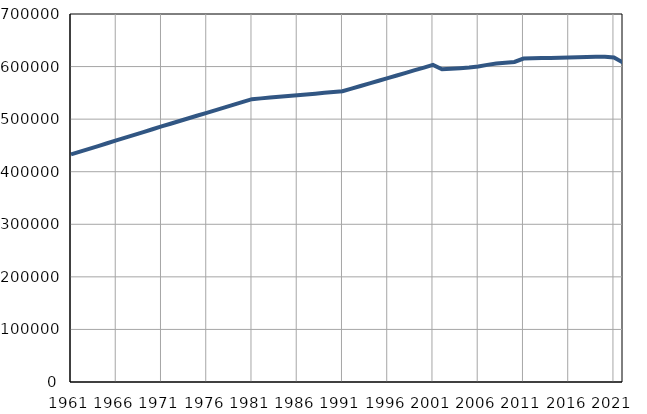
| Category | Број
становника |
|---|---|
| 1961.0 | 432873 |
| 1962.0 | 438194 |
| 1963.0 | 443515 |
| 1964.0 | 448836 |
| 1965.0 | 454157 |
| 1966.0 | 459478 |
| 1967.0 | 464799 |
| 1968.0 | 470120 |
| 1969.0 | 475441 |
| 1970.0 | 480762 |
| 1971.0 | 486083 |
| 1972.0 | 491276 |
| 1973.0 | 496470 |
| 1974.0 | 501663 |
| 1975.0 | 506856 |
| 1976.0 | 512050 |
| 1977.0 | 517243 |
| 1978.0 | 522436 |
| 1979.0 | 527629 |
| 1980.0 | 532823 |
| 1981.0 | 538016 |
| 1982.0 | 539517 |
| 1983.0 | 541018 |
| 1984.0 | 542519 |
| 1985.0 | 544020 |
| 1986.0 | 545522 |
| 1987.0 | 547023 |
| 1988.0 | 548524 |
| 1989.0 | 550025 |
| 1990.0 | 551526 |
| 1991.0 | 553027 |
| 1992.0 | 558039 |
| 1993.0 | 563052 |
| 1994.0 | 568064 |
| 1995.0 | 573077 |
| 1996.0 | 578089 |
| 1997.0 | 583102 |
| 1998.0 | 588114 |
| 1999.0 | 593127 |
| 2000.0 | 598139 |
| 2001.0 | 603152 |
| 2002.0 | 594769 |
| 2003.0 | 595825 |
| 2004.0 | 597010 |
| 2005.0 | 598331 |
| 2006.0 | 600204 |
| 2007.0 | 603244 |
| 2008.0 | 605720 |
| 2009.0 | 607282 |
| 2010.0 | 608725 |
| 2011.0 | 615190 |
| 2012.0 | 615616 |
| 2013.0 | 616111 |
| 2014.0 | 616378 |
| 2015.0 | 616722 |
| 2016.0 | 617333 |
| 2017.0 | 617949 |
| 2018.0 | 618388 |
| 2019.0 | 618829 |
| 2020.0 | 618624 |
| 2021.0 | 617177 |
| 2022.0 | 607654 |